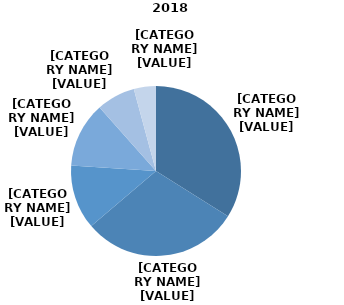
| Category | Series 0 |
|---|---|
| 60-64 ani | 0.339 |
| 65-69 ani | 0.299 |
| 70-74 ani | 0.123 |
| 75-79 ani | 0.124 |
| 80-84 ani | 0.073 |
| 85 ani şi peste | 0.042 |